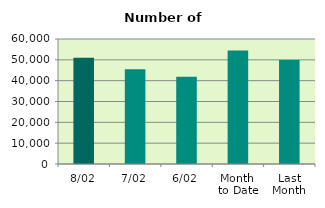
| Category | Series 0 |
|---|---|
| 8/02 | 50978 |
| 7/02 | 45476 |
| 6/02 | 41844 |
| Month 
to Date | 54429 |
| Last
Month | 49894.952 |